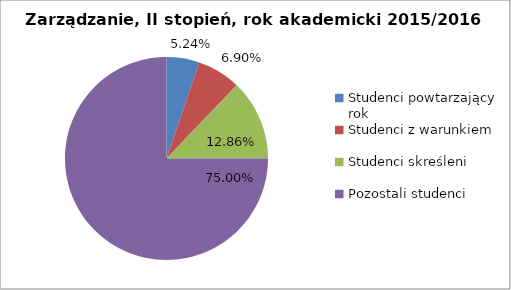
| Category | Series 0 |
|---|---|
| Studenci powtarzający rok | 22 |
| Studenci z warunkiem | 29 |
| Studenci skreśleni | 54 |
| Pozostali studenci | 315 |